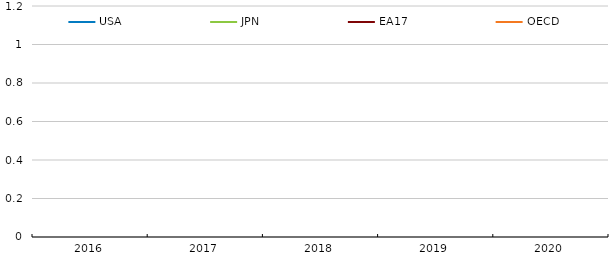
| Category | USA | JPN | EA17 | OECD |
|---|---|---|---|---|
| 2016.0 | 1.664 | 2.946 | 2.491 | 1.841 |
| 2017.0 | 2.764 | 1.374 | 2.425 | 2.077 |
| 2018.0 | 2.873 | 2.642 | 2.511 | 2.37 |
| 2019.0 | 2.872 | 1.481 | 2.185 | 2.106 |
| 2020.0 | -1.034 | -1.703 | -3.025 | -2.037 |